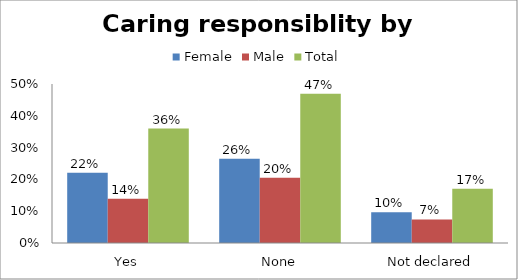
| Category | Female | Male | Total |
|---|---|---|---|
| Yes | 0.221 | 0.139 | 0.36 |
| None | 0.265 | 0.205 | 0.469 |
| Not declared | 0.097 | 0.074 | 0.171 |